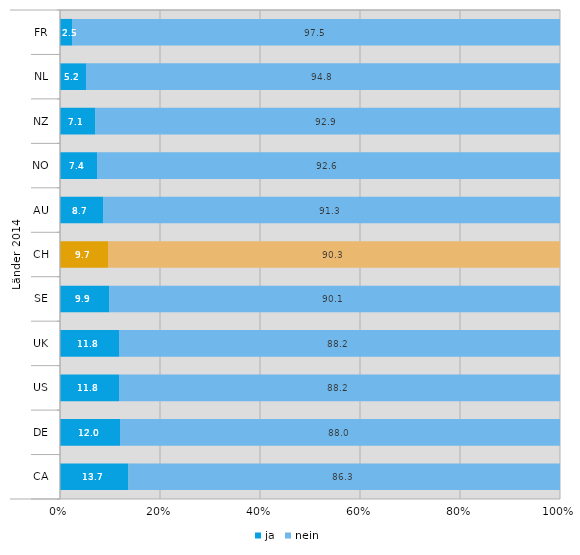
| Category | ja | nein |
|---|---|---|
| 0 | 2.5 | 97.5 |
| 1 | 5.2 | 94.8 |
| 2 | 7.1 | 92.9 |
| 3 | 7.4 | 92.6 |
| 4 | 8.7 | 91.3 |
| 5 | 9.7 | 90.3 |
| 6 | 9.9 | 90.1 |
| 7 | 11.8 | 88.2 |
| 8 | 11.8 | 88.2 |
| 9 | 12 | 88 |
| 10 | 13.7 | 86.3 |